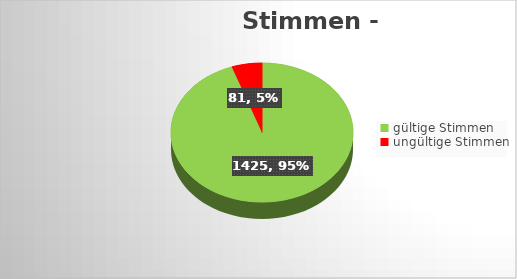
| Category | Series 0 |
|---|---|
| gültige Stimmen | 1425 |
| ungültige Stimmen | 81 |